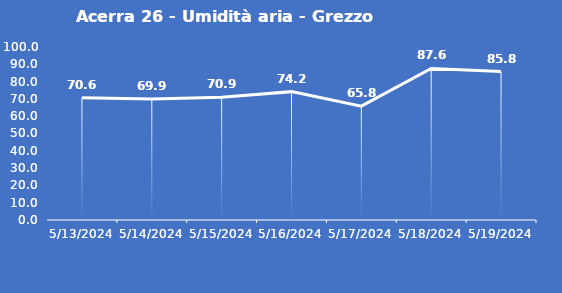
| Category | Acerra 26 - Umidità aria - Grezzo (%) |
|---|---|
| 5/13/24 | 70.6 |
| 5/14/24 | 69.9 |
| 5/15/24 | 70.9 |
| 5/16/24 | 74.2 |
| 5/17/24 | 65.8 |
| 5/18/24 | 87.6 |
| 5/19/24 | 85.8 |